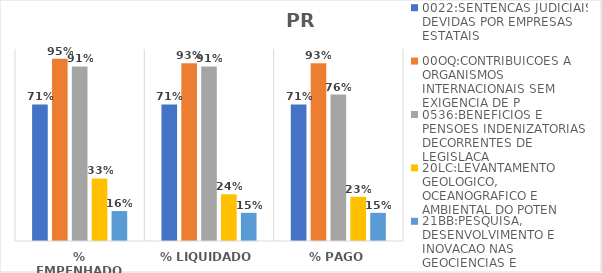
| Category | 0022:SENTENCAS JUDICIAIS DEVIDAS POR EMPRESAS ESTATAIS | 00OQ:CONTRIBUICOES A ORGANISMOS INTERNACIONAIS SEM EXIGENCIA DE P | 0536:BENEFICIOS E PENSOES INDENIZATORIAS DECORRENTES DE LEGISLACA | 20LC:LEVANTAMENTO GEOLOGICO, OCEANOGRAFICO E AMBIENTAL DO POTEN | 21BB:PESQUISA, DESENVOLVIMENTO E INOVACAO NAS GEOCIENCIAS E |
|---|---|---|---|---|---|
| % EMPENHADO | 0.711 | 0.95 | 0.909 | 0.326 | 0.156 |
| % LIQUIDADO | 0.711 | 0.926 | 0.909 | 0.243 | 0.147 |
| % PAGO | 0.711 | 0.926 | 0.763 | 0.23 | 0.147 |